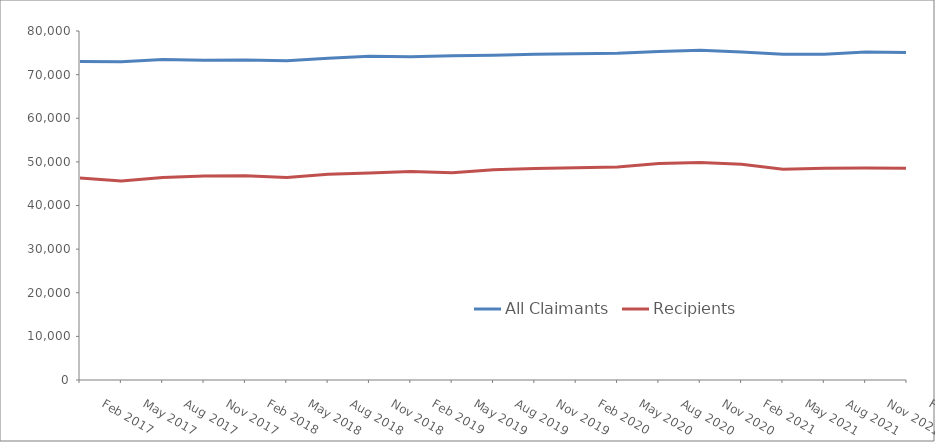
| Category | All Claimants | Recipients |
|---|---|---|
| Feb 2017 | 73020 | 46300 |
| May 2017 | 72970 | 45610 |
| Aug 2017 | 73450 | 46400 |
| Nov 2017 | 73280 | 46770 |
| Feb 2018 | 73350 | 46820 |
| May 2018 | 73200 | 46430 |
| Aug 2018 | 73730 | 47150 |
| Nov 2018 | 74210 | 47450 |
| Feb 2019 | 74070 | 47810 |
| May 2019 | 74340 | 47510 |
| Aug 2019 | 74420 | 48170 |
| Nov 2019 | 74690 | 48500 |
| Feb 2020 | 74800 | 48650 |
| May 2020 | 74910 | 48810 |
| Aug 2020 | 75280 | 49650 |
| Nov 2020 | 75610 | 49870 |
| Feb 2021 | 75210 | 49460 |
| May 2021 | 74690 | 48300 |
| Aug 2021 | 74690 | 48520 |
| Nov 2021 | 75170 | 48600 |
| Feb 2022 | 75050 | 48540 |